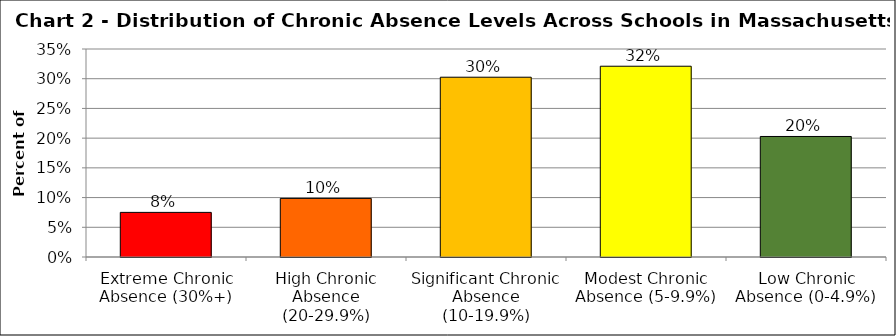
| Category | Series 1 |
|---|---|
| Extreme Chronic Absence (30%+) | 0.075 |
| High Chronic Absence (20-29.9%) | 0.099 |
| Significant Chronic Absence (10-19.9%) | 0.303 |
| Modest Chronic Absence (5-9.9%) | 0.321 |
| Low Chronic Absence (0-4.9%) | 0.203 |